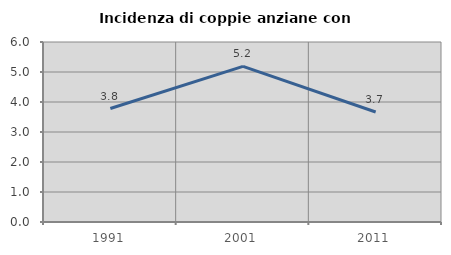
| Category | Incidenza di coppie anziane con figli |
|---|---|
| 1991.0 | 3.782 |
| 2001.0 | 5.185 |
| 2011.0 | 3.667 |